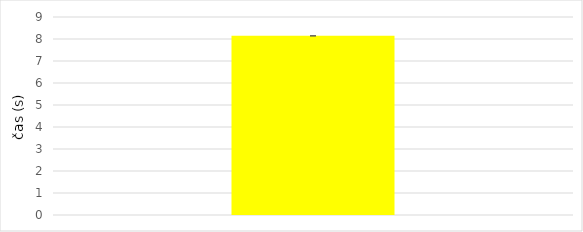
| Category | Series 0 |
|---|---|
| 0 | 8.143 |